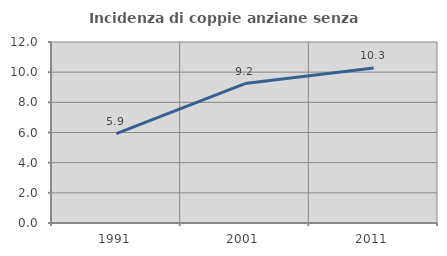
| Category | Incidenza di coppie anziane senza figli  |
|---|---|
| 1991.0 | 5.92 |
| 2001.0 | 9.242 |
| 2011.0 | 10.274 |